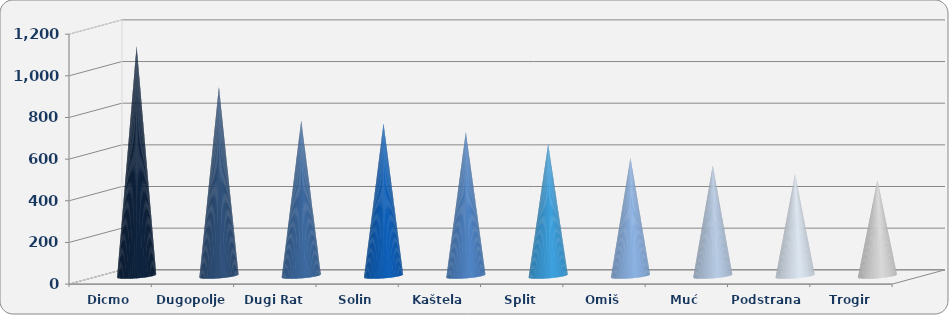
| Category | Produktivnost |
|---|---|
| Dicmo | 1104.772 |
| Dugopolje | 907.503 |
| Dugi Rat | 747.12 |
| Solin | 732.786 |
| Kaštela | 691.286 |
| Split | 633.21 |
| Omiš | 567.765 |
| Muć | 530.551 |
| Podstrana | 490.298 |
| Trogir | 460.211 |